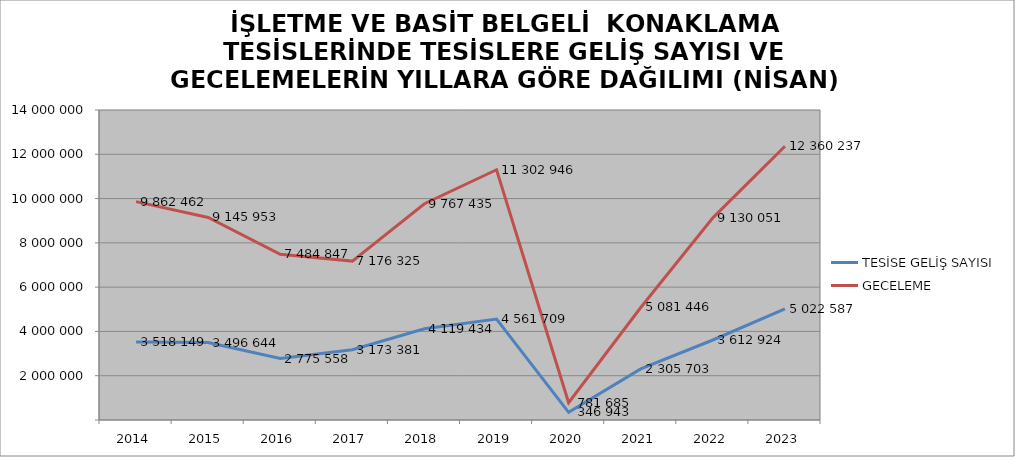
| Category | TESİSE GELİŞ SAYISI | GECELEME |
|---|---|---|
| 2014 | 3518149 | 9862462 |
| 2015 | 3496644 | 9145953 |
| 2016 | 2775558 | 7484847 |
| 2017 | 3173381 | 7176325 |
| 2018 | 4119434 | 9767435 |
| 2019 | 4561709 | 11302946 |
| 2020 | 346943 | 781685 |
| 2021 | 2305703 | 5081446 |
| 2022 | 3612924 | 9130051 |
| 2023 | 5022587 | 12360237 |